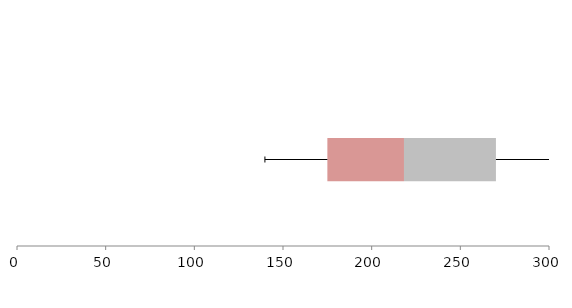
| Category | Series 1 | Series 2 | Series 3 |
|---|---|---|---|
| 0 | 175.021 | 43.203 | 51.855 |